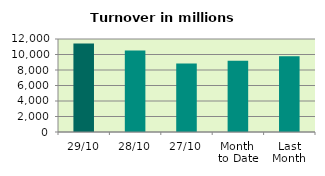
| Category | Series 0 |
|---|---|
| 29/10 | 11412.507 |
| 28/10 | 10523.233 |
| 27/10 | 8828.509 |
| Month 
to Date | 9192.028 |
| Last
Month | 9769.37 |